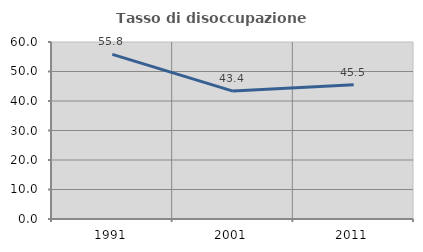
| Category | Tasso di disoccupazione giovanile  |
|---|---|
| 1991.0 | 55.786 |
| 2001.0 | 43.357 |
| 2011.0 | 45.528 |